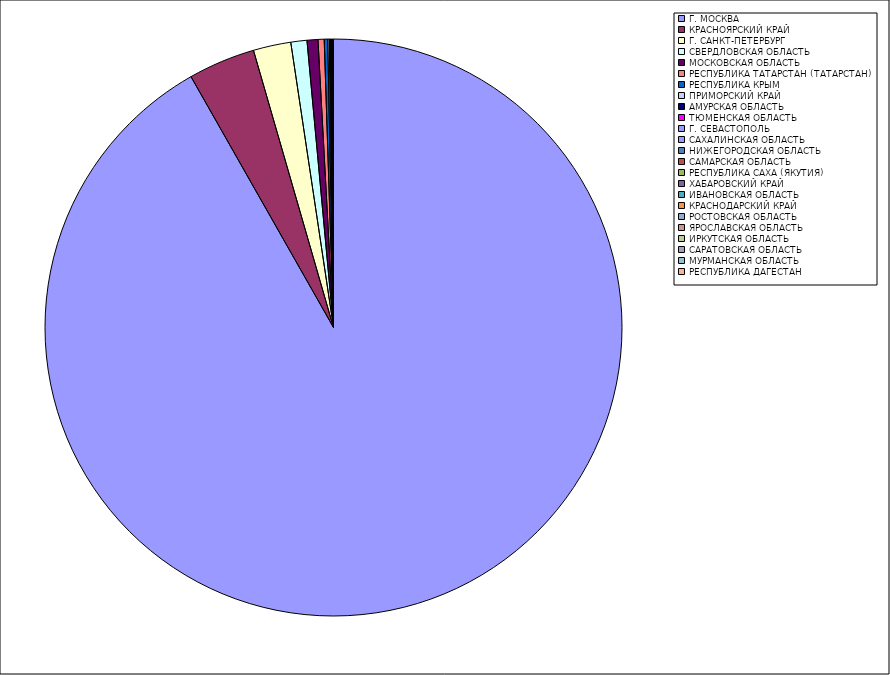
| Category | Оборот |
|---|---|
| Г. МОСКВА | 91.728 |
| КРАСНОЯРСКИЙ КРАЙ | 3.747 |
| Г. САНКТ-ПЕТЕРБУРГ | 2.105 |
| СВЕРДЛОВСКАЯ ОБЛАСТЬ | 0.9 |
| МОСКОВСКАЯ ОБЛАСТЬ | 0.609 |
| РЕСПУБЛИКА ТАТАРСТАН (ТАТАРСТАН) | 0.344 |
| РЕСПУБЛИКА КРЫМ | 0.193 |
| ПРИМОРСКИЙ КРАЙ | 0.086 |
| АМУРСКАЯ ОБЛАСТЬ | 0.046 |
| ТЮМЕНСКАЯ ОБЛАСТЬ | 0.028 |
| Г. СЕВАСТОПОЛЬ | 0.018 |
| САХАЛИНСКАЯ ОБЛАСТЬ | 0.016 |
| НИЖЕГОРОДСКАЯ ОБЛАСТЬ | 0.016 |
| САМАРСКАЯ ОБЛАСТЬ | 0.015 |
| РЕСПУБЛИКА САХА (ЯКУТИЯ) | 0.014 |
| ХАБАРОВСКИЙ КРАЙ | 0.013 |
| ИВАНОВСКАЯ ОБЛАСТЬ | 0.012 |
| КРАСНОДАРСКИЙ КРАЙ | 0.012 |
| РОСТОВСКАЯ ОБЛАСТЬ | 0.009 |
| ЯРОСЛАВСКАЯ ОБЛАСТЬ | 0.009 |
| ИРКУТСКАЯ ОБЛАСТЬ | 0.008 |
| САРАТОВСКАЯ ОБЛАСТЬ | 0.008 |
| МУРМАНСКАЯ ОБЛАСТЬ | 0.006 |
| РЕСПУБЛИКА ДАГЕСТАН | 0.005 |